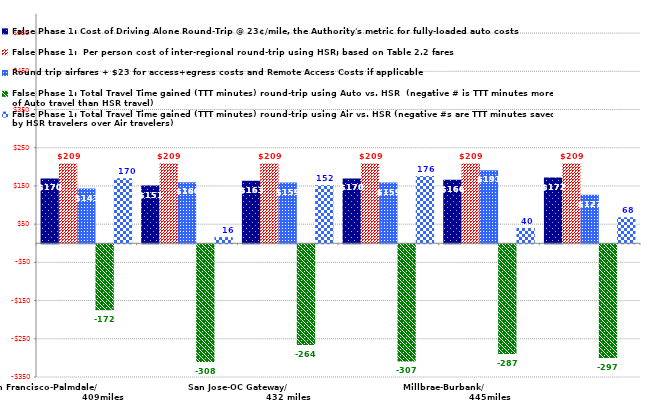
| Category | False Phase 1: Cost of Driving Alone Round-Trip @ 23¢/mile, the Authority's metric for fully-loaded auto costs | False Phase 1:  Per person cost of inter-regional round-trip using HSR; based on Table 2.2 fares | Round trip airfares + $23 for access+egress costs and Remote Access Costs if applicable | False Phase 1: Total Travel Time gained (TTT minutes) round-trip using Auto vs. HSR  (negative # is TTT minutes more of Auto travel than HSR travel) | False Phase 1: Total Travel Time gained (TTT minutes) round-trip using Air vs. HSR (negative #s are TTT minutes saved by HSR travelers over Air travelers) |
|---|---|---|---|---|---|
| San Francisco-Palmdale/                                           409miles | 169.74 | 209 | 143 | -172.4 | 170 |
| San Jose-Burbank (BUR)/                            412miles | 150.88 | 209 | 160 | -307.8 | 16 |
| San Jose-OC Gateway/                                     432 miles | 163.3 | 209 | 159 | -263.8 | 152 |
| San Jose-Anaheim/                         445miles | 169.74 | 209 | 159 | -306.5 | 176 |
| Millbrae-Burbank/                                  445miles | 166.06 | 209 | 191 | -287.4 | 40 |
| Millbrae-Los Angeles/                             451miles | 172.04 | 209 | 127 | -297.4 | 68 |